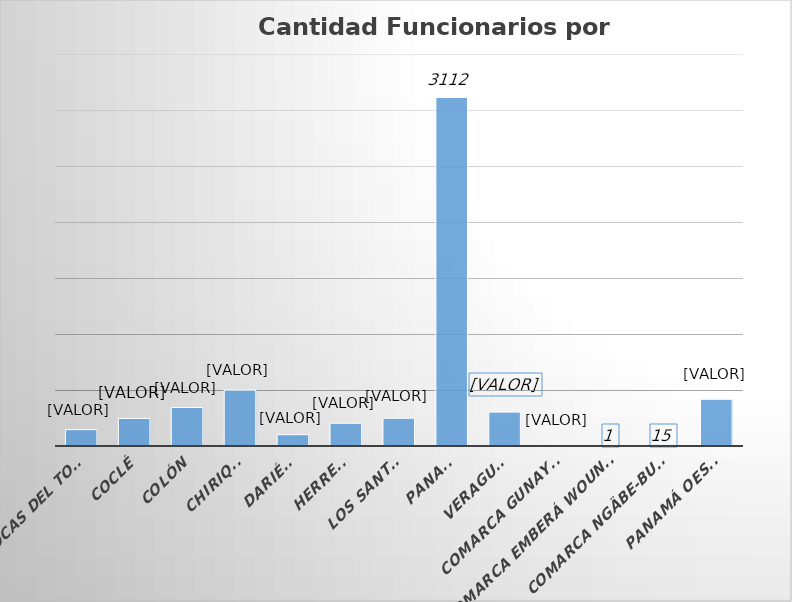
| Category | Cantidad  |
|---|---|
| BOCAS DEL TORO | 146 |
| COCLÉ | 246 |
| COLÓN | 344 |
| CHIRIQUÍ | 499 |
| DARIÉN | 101 |
| HERRERA | 203 |
| LOS SANTOS | 248 |
| PANAMÁ | 3112 |
| VERAGUAS | 303 |
| COMARCA GUNAYALA | 6 |
| COMARCA EMBERÁ WOUNAAN | 1 |
| COMARCA NGÄBE-BUGLÉ | 15 |
| PANAMÁ OESTE | 417 |